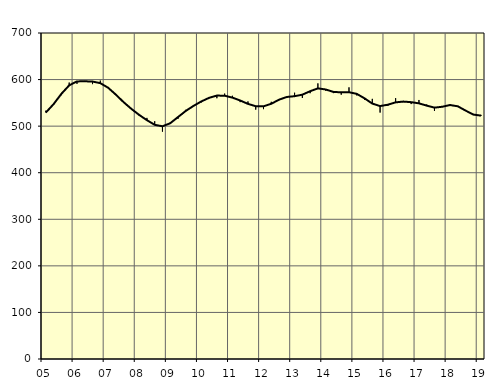
| Category | Trend | Säsongrensat |
|---|---|---|
| 5.0 | 529.3 | 533.3 |
| nan | 547.46 | 546.2 |
| 6.0 | 569.52 | 566.5 |
| 6.0 | 587.59 | 593.6 |
| 6.0 | 596.04 | 590.8 |
| nan | 596.32 | 597.1 |
| 7.0 | 595.74 | 590.2 |
| 7.0 | 592.31 | 597.8 |
| 7.0 | 582.57 | 583.7 |
| nan | 567.7 | 566.6 |
| 8.0 | 551.49 | 550.1 |
| 8.0 | 537.06 | 537 |
| 8.0 | 524.17 | 522.7 |
| nan | 512.78 | 517.7 |
| 9.0 | 502.85 | 510.6 |
| 9.0 | 499.69 | 488.1 |
| 9.0 | 506.25 | 507.7 |
| nan | 519.51 | 515.7 |
| 10.0 | 532.66 | 535.1 |
| 10.0 | 543.56 | 545.2 |
| 10.0 | 553.06 | 551 |
| nan | 560.79 | 560.4 |
| 11.0 | 565.65 | 559.9 |
| 11.0 | 565.32 | 569.9 |
| 11.0 | 561.28 | 565.2 |
| nan | 555.04 | 551.6 |
| 12.0 | 547.81 | 553.1 |
| 12.0 | 542.8 | 535.5 |
| 12.0 | 542.52 | 536.5 |
| nan | 548.02 | 552.3 |
| 13.0 | 556.86 | 555.6 |
| 13.0 | 562.65 | 562.8 |
| 13.0 | 564.3 | 571.8 |
| nan | 567.57 | 560.5 |
| 14.0 | 575.02 | 570.7 |
| 14.0 | 581.1 | 591.8 |
| 14.0 | 578.74 | 576.2 |
| nan | 573.49 | 570.9 |
| 15.0 | 572.62 | 567.5 |
| 15.0 | 572.85 | 583.3 |
| 15.0 | 569.32 | 565.9 |
| nan | 559.71 | 556.6 |
| 16.0 | 548.46 | 558.6 |
| 16.0 | 543.09 | 529.1 |
| 16.0 | 546.04 | 543.6 |
| nan | 551.1 | 560.1 |
| 17.0 | 552.74 | 551.4 |
| 17.0 | 551.51 | 547.4 |
| 17.0 | 548.96 | 556.2 |
| nan | 544.08 | 546.4 |
| 18.0 | 539.74 | 532.5 |
| 18.0 | 541.64 | 542.6 |
| 18.0 | 545.36 | 546.2 |
| nan | 542.6 | 543.3 |
| 19.0 | 533.41 | 532.7 |
| 19.0 | 524.9 | 523.7 |
| 19.0 | 522.53 | 524 |